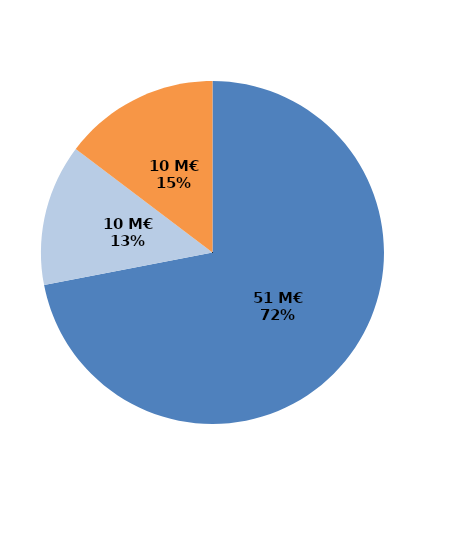
| Category | Series 0 |
|---|---|
| Formations certifiantes et pré-certifiantes | 51.273 |
| Formations professionnalisantes | 9.51 |
| Formations d'insertion sociale et professionnelle | 10.466 |